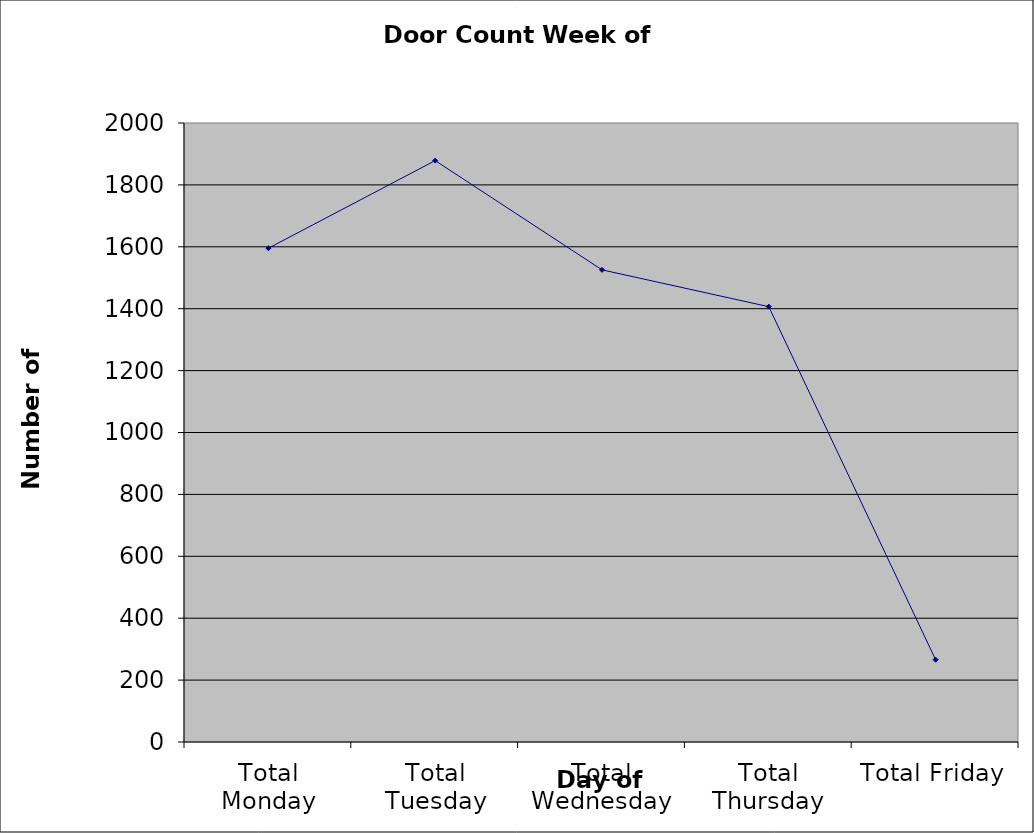
| Category | Series 0 |
|---|---|
| Total Monday | 1595.5 |
| Total Tuesday | 1878.5 |
| Total Wednesday | 1525.5 |
| Total Thursday | 1406.5 |
| Total Friday | 266 |